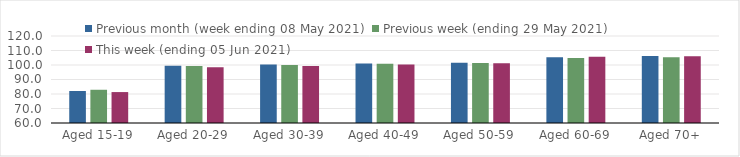
| Category | Previous month (week ending 08 May 2021) | Previous week (ending 29 May 2021) | This week (ending 05 Jun 2021) |
|---|---|---|---|
| Aged 15-19 | 82.06 | 82.92 | 81.33 |
| Aged 20-29 | 99.48 | 99.26 | 98.45 |
| Aged 30-39 | 100.42 | 100.03 | 99.3 |
| Aged 40-49 | 100.99 | 100.79 | 100.34 |
| Aged 50-59 | 101.49 | 101.31 | 101.16 |
| Aged 60-69 | 105.36 | 104.87 | 105.62 |
| Aged 70+ | 106.14 | 105.38 | 106.1 |